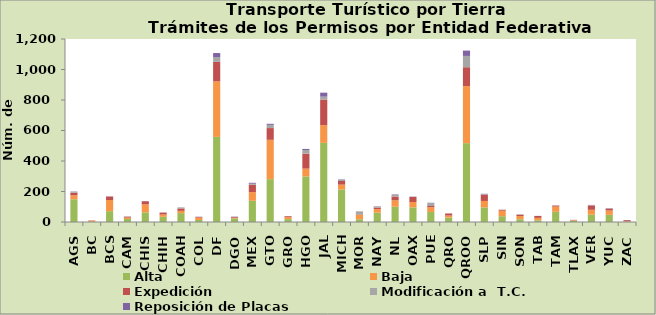
| Category | Alta                                         | Baja | Expedición | Modificación a  T.C. | Reposición de Placas | Otros |
|---|---|---|---|---|---|---|
| AGS | 149 | 26 | 17 | 6 | 2 |  |
| BC | 2 | 7 | 2 | 0 | 0 |  |
| BCS | 71 | 73 | 23 | 0 | 1 |  |
| CAM | 20 | 9 | 6 | 2 | 0 |  |
| CHIS | 63 | 53 | 20 | 0 | 1 |  |
| CHIH | 34 | 15 | 13 | 0 | 0 |  |
| COAH | 58 | 15 | 16 | 7 | 0 |  |
| COL | 13 | 16 | 4 | 1 | 1 |  |
| DF | 558 | 364 | 128 | 32 | 26 |  |
| DGO | 24 | 4 | 5 | 0 | 2 |  |
| MEX | 139 | 57 | 48 | 7 | 6 |  |
| GTO | 281 | 258 | 77 | 21 | 7 |  |
| GRO | 19 | 13 | 6 | 1 | 0 |  |
| HGO | 299 | 51 | 98 | 24 | 7 |  |
| JAL | 519 | 116 | 168 | 19 | 26 |  |
| MICH | 213 | 32 | 24 | 7 | 3 |  |
| MOR | 18 | 29 | 3 | 20 | 0 |  |
| NAY | 61 | 24 | 10 | 6 | 2 |  |
| NL | 100 | 42 | 25 | 11 | 3 |  |
| OAX | 96 | 35 | 33 | 2 | 1 |  |
| PUE | 66 | 31 | 8 | 19 | 2 |  |
| QRO | 30 | 12 | 14 | 0 | 0 |  |
| QROO | 517 | 374 | 124 | 74 | 35 |  |
| SLP | 96 | 42 | 41 | 3 | 3 |  |
| SIN | 38 | 36 | 6 | 1 | 0 |  |
| SON | 18 | 21 | 9 | 1 | 1 |  |
| TAB | 11 | 16 | 13 | 0 | 0 |  |
| TAM | 67 | 34 | 7 | 1 | 0 |  |
| TLAX | 8 | 3 | 3 | 0 | 0 |  |
| VER | 48 | 32 | 28 | 2 | 2 |  |
| YUC | 47 | 28 | 13 | 2 | 1 |  |
| ZAC | 1 | 4 | 7 | 0 | 1 |  |